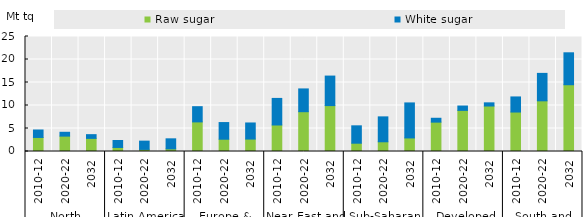
| Category | Raw sugar | White sugar |
|---|---|---|
| 0 | 3051.667 | 1621.333 |
| 1 | 3344 | 832.667 |
| 2 | 2850.112 | 812.729 |
| 3 | 878.113 | 1518.113 |
| 4 | 453.802 | 1800.421 |
| 5 | 577.001 | 2179.026 |
| 6 | 6434.877 | 3308.181 |
| 7 | 2669.826 | 3622.512 |
| 8 | 2703.564 | 3499.331 |
| 9 | 5762.89 | 5777.556 |
| 10 | 8652.848 | 4951.106 |
| 11 | 9978.895 | 6418.11 |
| 12 | 1803.132 | 3779.002 |
| 13 | 2112.278 | 5416.942 |
| 14 | 2948.409 | 7611.852 |
| 15 | 6385 | 839 |
| 16 | 8935.667 | 950.333 |
| 17 | 9887.471 | 690.28 |
| 18 | 8578.891 | 3283.557 |
| 19 | 11016.23 | 5966.093 |
| 20 | 14514.33 | 6942.69 |